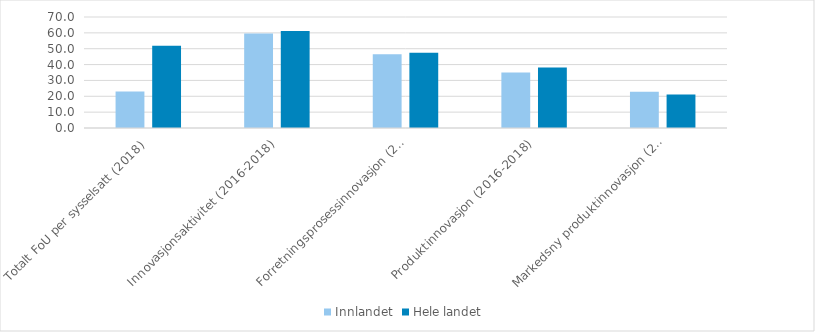
| Category | Innlandet | Hele landet  |
|---|---|---|
| Totalt FoU per sysselsatt (2018) | 22.952 | 51.82 |
| Innovasjonsaktivitet (2016-2018) | 59.572 | 61.147 |
| Forretningsprosessinnovasjon (2016-2018) | 46.524 | 47.427 |
| Produktinnovasjon (2016-2018) | 35.048 | 38.209 |
| Markedsny produktinnovasjon (2016-2018) | 22.93 | 21.052 |